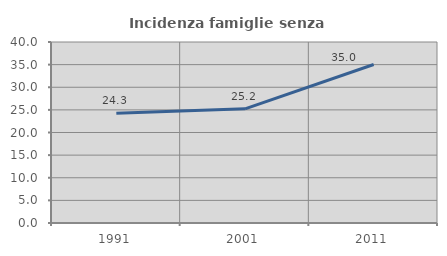
| Category | Incidenza famiglie senza nuclei |
|---|---|
| 1991.0 | 24.252 |
| 2001.0 | 25.23 |
| 2011.0 | 35.029 |